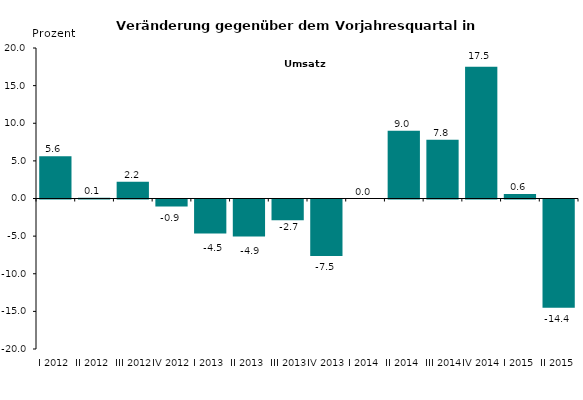
| Category | Series 0 |
|---|---|
| I 2012 | 5.603 |
| II 2012 | 0.11 |
| III 2012 | 2.228 |
| IV 2012 | -0.936 |
| I 2013 | -4.513 |
| II 2013 | -4.922 |
| III 2013 | -2.749 |
| IV 2013 | -7.5 |
| I 2014 | 0 |
| II 2014 | 9 |
| III 2014 | 7.8 |
| IV 2014 | 17.5 |
| I 2015 | 0.6 |
| II 2015 | -14.4 |